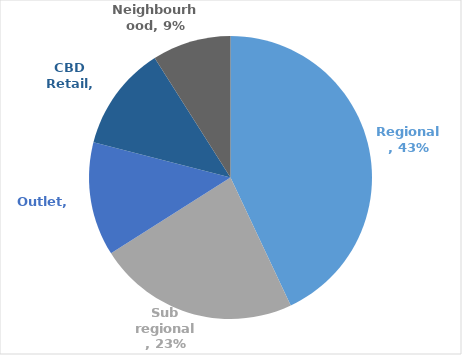
| Category | Series 0 |
|---|---|
| Regional | 0.43 |
| Sub regional | 0.23 |
| Outlet | 0.13 |
| CBD Retail | 0.12 |
| Neighbourhood | 0.09 |